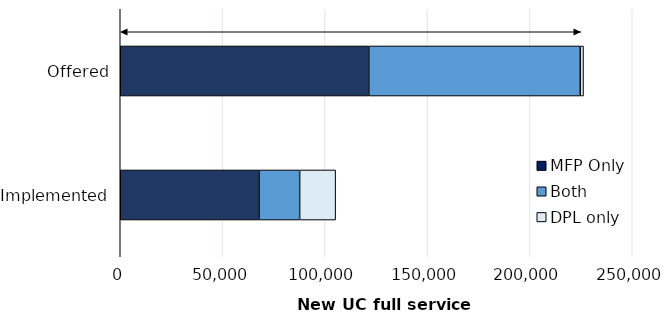
| Category | MFP Only | Both | DPL only |
|---|---|---|---|
| Offered | 121370 | 103250 | 1580 |
| Implemented | 67780 | 19820 | 17570 |